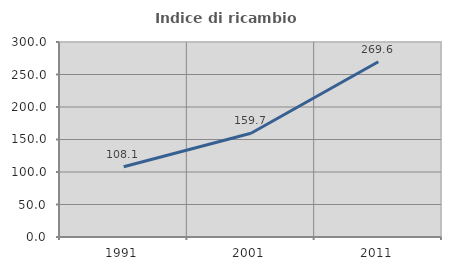
| Category | Indice di ricambio occupazionale  |
|---|---|
| 1991.0 | 108.062 |
| 2001.0 | 159.675 |
| 2011.0 | 269.647 |